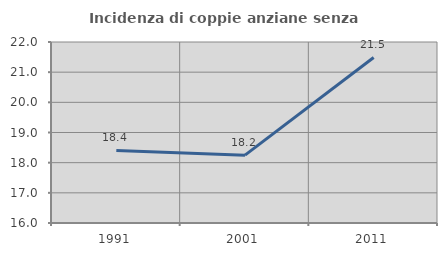
| Category | Incidenza di coppie anziane senza figli  |
|---|---|
| 1991.0 | 18.405 |
| 2001.0 | 18.248 |
| 2011.0 | 21.488 |